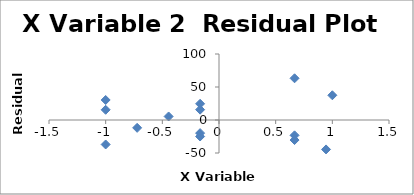
| Category | Series 0 |
|---|---|
| -0.9999999999999988 | 30.346 |
| -0.9999999999999988 | 15.477 |
| 0.6666666666666675 | -30.364 |
| 0.6666666666666675 | -23.234 |
| -0.44444444444444253 | 5.341 |
| -0.7222222222222219 | -11.873 |
| 0.6666666666666675 | 63.201 |
| -0.16666666666666563 | -25.009 |
| -0.16666666666666563 | -19.878 |
| -0.9999999999999988 | -37.088 |
| 0.9444444444444469 | -44.584 |
| -0.16666666666666563 | 24.556 |
| 1.0000000000000013 | 37.459 |
| -0.16666666666666563 | 15.651 |